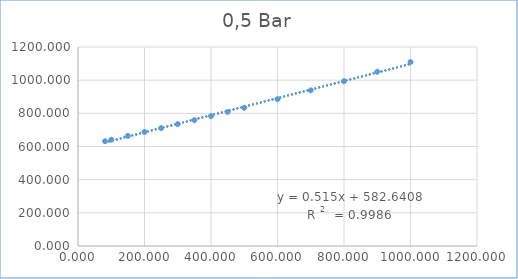
| Category | Series 0 |
|---|---|
| 81.3 | 631.916 |
| 100.0 | 640.803 |
| 150.0 | 664.166 |
| 200.0 | 687.482 |
| 250.0 | 710.965 |
| 300.0 | 734.783 |
| 350.0 | 758.911 |
| 400.0 | 783.397 |
| 450.0 | 808.29 |
| 500.0 | 833.564 |
| 600.0 | 885.332 |
| 700.0 | 938.772 |
| 800.0 | 993.884 |
| 900.0 | 1050.693 |
| 1000.0 | 1109.102 |